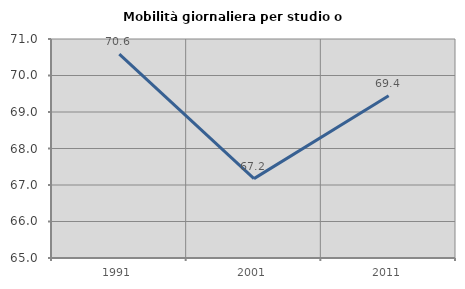
| Category | Mobilità giornaliera per studio o lavoro |
|---|---|
| 1991.0 | 70.584 |
| 2001.0 | 67.175 |
| 2011.0 | 69.445 |